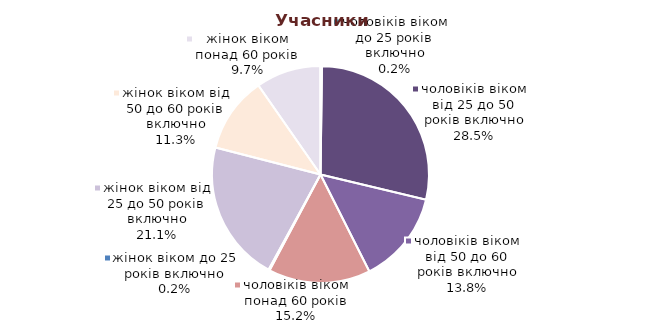
| Category | Series 0 |
|---|---|
| жінок віком до 25 років включно | 1494 |
| жінок віком від 25 до 50 років включно | 184065 |
| жінок віком від 50 до 60 років включно | 98678 |
| жінок віком понад 60 років | 84450 |
| чоловіків віком до 25 років включно | 2130 |
| чоловіків віком від 25 до 50 років включно | 249050 |
| чоловіків віком від 50 до 60 років включно | 120972 |
| чоловіків віком понад 60 років | 132870 |